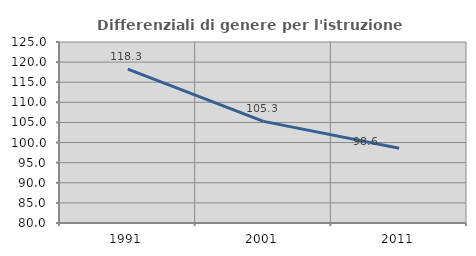
| Category | Differenziali di genere per l'istruzione superiore |
|---|---|
| 1991.0 | 118.258 |
| 2001.0 | 105.271 |
| 2011.0 | 98.598 |